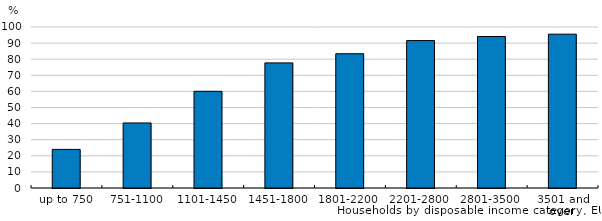
| Category | Private car ownership |
|---|---|
| up to 750 | 23.975 |
| 751-1100 | 40.394 |
| 1101-1450 | 60.046 |
| 1451-1800 | 77.708 |
| 1801-2200 | 83.395 |
| 2201-2800 | 91.557 |
| 2801-3500 | 94.085 |
| 3501 and over  | 95.544 |